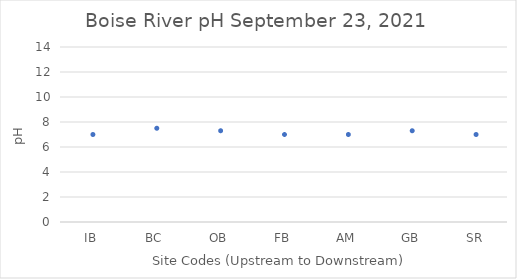
| Category | pH  |
|---|---|
| IB | 7 |
| BC | 7.5 |
| OB | 7.3 |
| FB | 7 |
| AM | 7 |
| GB | 7.3 |
| SR | 7 |